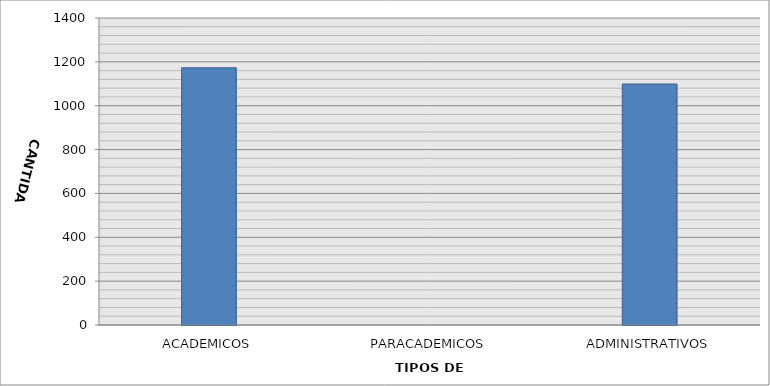
| Category | CANTIDAD |
|---|---|
| ACADEMICOS | 1173 |
| PARACADEMICOS | 0 |
| ADMINISTRATIVOS | 1099 |